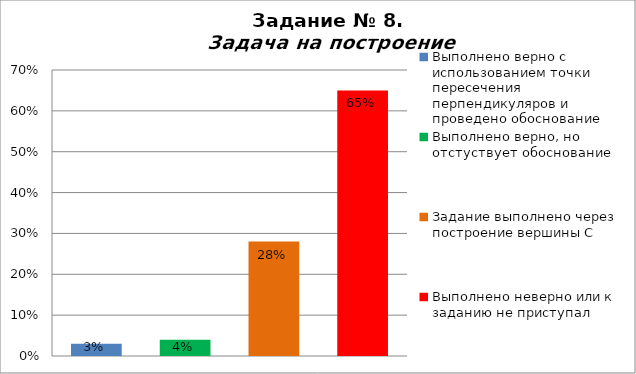
| Category | Задача на построение |
|---|---|
| Выполнено верно с использованием точки пересечения перпендикуляров и проведено обоснование | 0.03 |
| Выполнено верно, но отстуствует обоснование | 0.04 |
| Задание выполнено через построение вершины С | 0.28 |
| Выполнено неверно или к заданию не приступал | 0.65 |